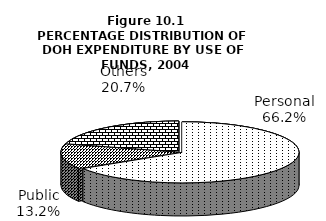
| Category | Series 0 |
|---|---|
| Personal | 10204.703 |
| Public | 2034.807 |
| Others | 3185.701 |